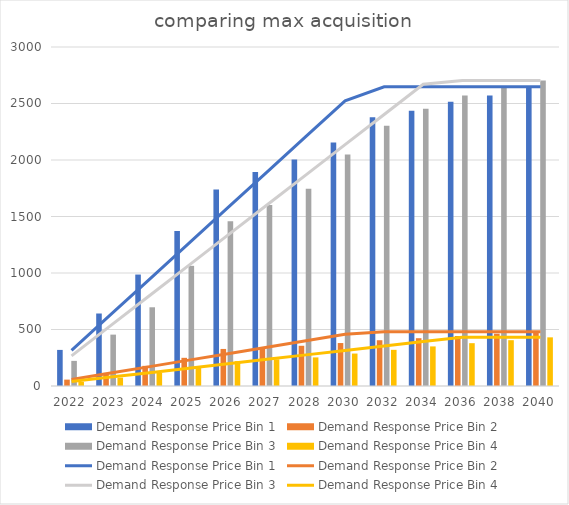
| Category | Demand Response Price Bin 1 | Demand Response Price Bin 2 | Demand Response Price Bin 3 | Demand Response Price Bin 4 |
|---|---|---|---|---|
| 2022.0 | 319.398 | 56.532 | 222.266 | 36.125 |
| 2023.0 | 641.553 | 115.647 | 454.663 | 73.935 |
| 2024.0 | 986.255 | 178.185 | 696.678 | 115.598 |
| 2025.0 | 1371.524 | 249.367 | 1063.254 | 164.023 |
| 2026.0 | 1739.98 | 327.922 | 1458.311 | 219.756 |
| 2027.0 | 1893.122 | 343.268 | 1601.927 | 236.139 |
| 2028.0 | 2005.527 | 355.979 | 1744.79 | 252.978 |
| 2030.0 | 2155.201 | 380.192 | 2049.564 | 287.14 |
| 2032.0 | 2378.07 | 405.012 | 2303.471 | 320.009 |
| 2034.0 | 2434.917 | 422.97 | 2453.132 | 350.361 |
| 2036.0 | 2514.87 | 442.732 | 2569.944 | 378.979 |
| 2038.0 | 2571.37 | 462.915 | 2641.14 | 405.388 |
| 2040.0 | 2647.9 | 479.512 | 2703.313 | 430.57 |